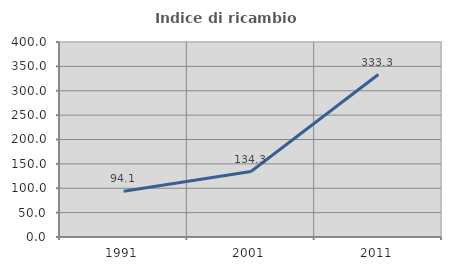
| Category | Indice di ricambio occupazionale  |
|---|---|
| 1991.0 | 94.063 |
| 2001.0 | 134.346 |
| 2011.0 | 333.333 |